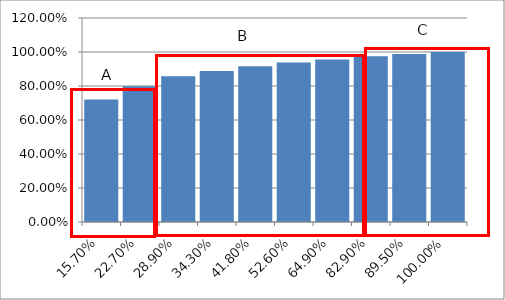
| Category | Series 0 |
|---|---|
| 0.157 | 0.72 |
| 0.227 | 0.798 |
| 0.28900000000000003 | 0.858 |
| 0.343 | 0.888 |
| 0.41800000000000004 | 0.916 |
| 0.526 | 0.938 |
| 0.649 | 0.957 |
| 0.829 | 0.974 |
| 0.895 | 0.989 |
| 1.0 | 1 |